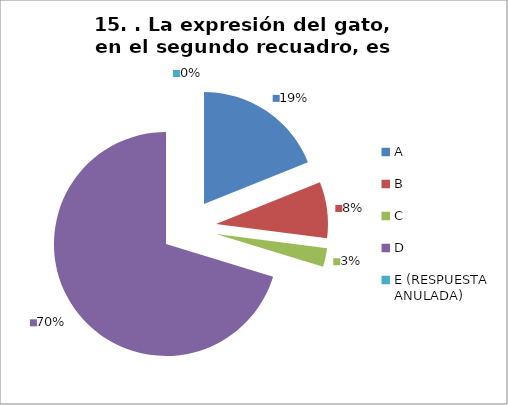
| Category | CANTIDAD DE RESPUESTAS PREGUNTA (15) | PORCENTAJE |
|---|---|---|
| A | 7 | 0.189 |
| B | 3 | 0.081 |
| C | 1 | 0.027 |
| D | 26 | 0.703 |
| E (RESPUESTA ANULADA) | 0 | 0 |